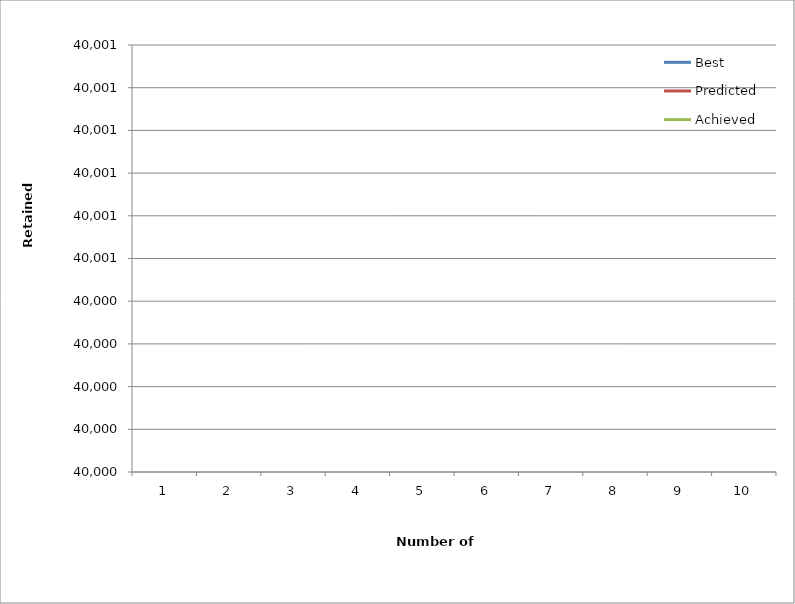
| Category | Best | Predicted | Achieved |
|---|---|---|---|
| 1.0 | 0 | 0 | 0 |
| 2.0 | 0 | 0 | 0 |
| 3.0 | 0 | 0 | 0 |
| 4.0 | 0 | 0 | 0 |
| 5.0 | 0 | 0 | 0 |
| 6.0 | 0 | 0 | 0 |
| 7.0 | 0 | 0 | 0 |
| 8.0 | 0 | 0 | 0 |
| 9.0 | 0 | 0 | 0 |
| 10.0 | 0 | 0 | 0 |